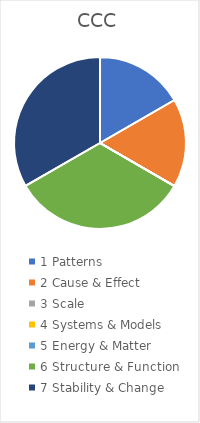
| Category | CCC |
|---|---|
| 1 Patterns | 0.167 |
| 2 Cause & Effect | 0.167 |
| 3 Scale | 0 |
| 4 Systems & Models | 0 |
| 5 Energy & Matter | 0 |
| 6 Structure & Function | 0.333 |
| 7 Stability & Change | 0.333 |